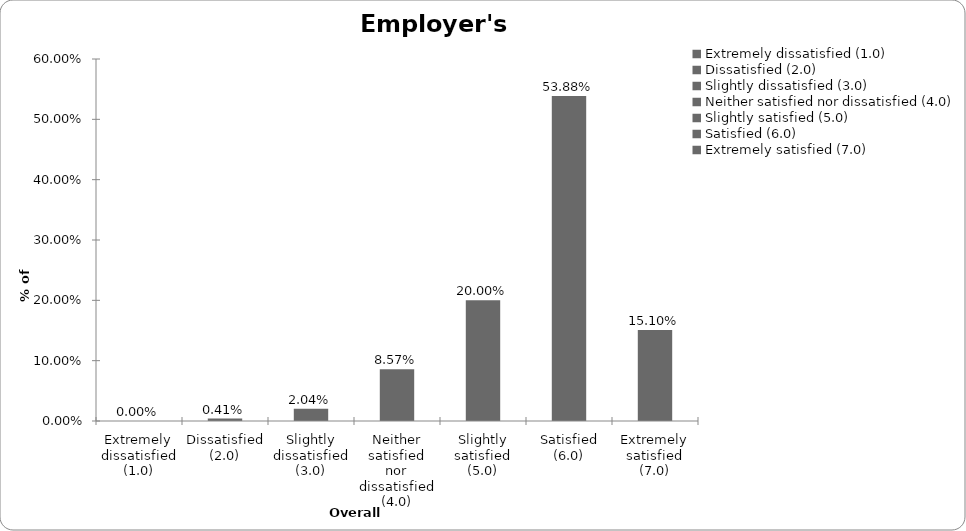
| Category | Employer's liability |
|---|---|
| Extremely dissatisfied (1.0) | 0 |
| Dissatisfied (2.0) | 0.004 |
| Slightly dissatisfied (3.0) | 0.02 |
| Neither satisfied nor dissatisfied (4.0) | 0.086 |
| Slightly satisfied (5.0) | 0.2 |
| Satisfied (6.0) | 0.539 |
| Extremely satisfied (7.0) | 0.151 |